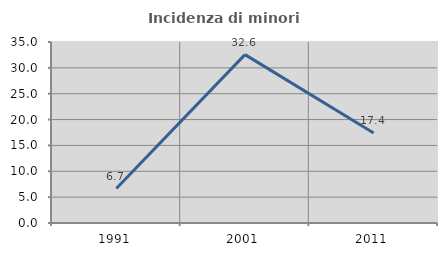
| Category | Incidenza di minori stranieri |
|---|---|
| 1991.0 | 6.667 |
| 2001.0 | 32.558 |
| 2011.0 | 17.391 |